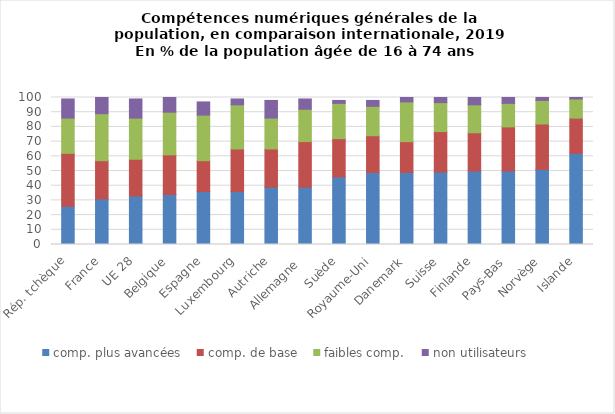
| Category | comp. plus avancées | comp. de base | faibles comp. | non utilisateurs |
|---|---|---|---|---|
| Rép. tchèque | 26 | 36 | 24 | 13 |
| France | 31 | 26 | 32 | 11 |
| UE 28 | 33 | 25 | 28 | 13 |
| Belgique | 34 | 27 | 29 | 10 |
| Espagne | 36 | 21 | 31 | 9 |
| Luxembourg | 36 | 29 | 30 | 4 |
| Autriche | 39 | 26 | 21 | 12 |
| Allemagne  | 39 | 31 | 22 | 7 |
| Suède | 46 | 26 | 24 | 2 |
| Royaume-Uni | 49 | 25 | 20 | 4 |
| Danemark | 49 | 21 | 27 | 3 |
| Suisse | 49.328 | 27.476 | 19.702 | 3.494 |
| Finlande | 50 | 26 | 19 | 5 |
| Pays-Bas | 50 | 30 | 16 | 4 |
| Norvège | 51 | 31 | 16 | 2 |
| Islande | 62 | 24 | 13 | 1 |